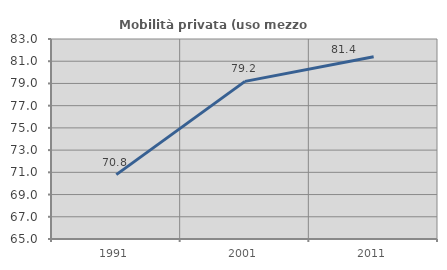
| Category | Mobilità privata (uso mezzo privato) |
|---|---|
| 1991.0 | 70.791 |
| 2001.0 | 79.185 |
| 2011.0 | 81.403 |